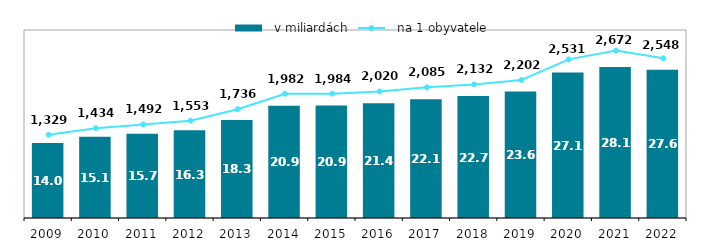
| Category |   v miliardách |
|---|---|
| 2009.0 | 13.962 |
| 2010.0 | 15.104 |
| 2011.0 | 15.676 |
| 2012.0 | 16.331 |
| 2013.0 | 18.255 |
| 2014.0 | 20.887 |
| 2015.0 | 20.936 |
| 2016.0 | 21.368 |
| 2017.0 | 22.122 |
| 2018.0 | 22.705 |
| 2019.0 | 23.553 |
| 2020.0 | 27.091 |
| 2021.0 | 28.096 |
| 2022.0 | 27.585 |